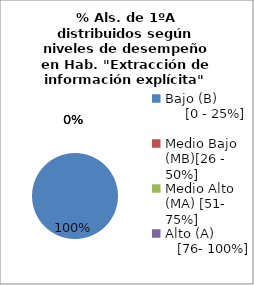
| Category | Series 0 |
|---|---|
| Bajo (B)              [0 - 25%] | 1 |
| Medio Bajo (MB)[26 - 50%] | 0 |
| Medio Alto (MA) [51- 75%] | 0 |
| Alto (A)             [76- 100%] | 0 |